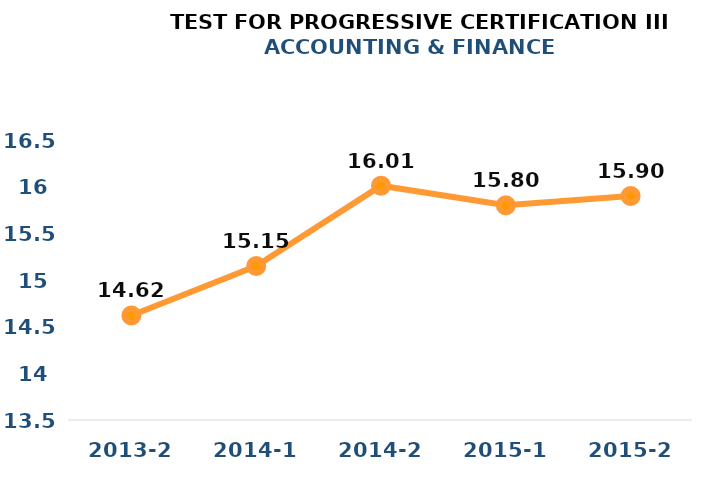
| Category | Series 0 |
|---|---|
| 2013-2 | 14.62 |
| 2014-1 | 15.15 |
| 2014-2 | 16.01 |
| 2015-1 | 15.8 |
| 2015-2 | 15.9 |